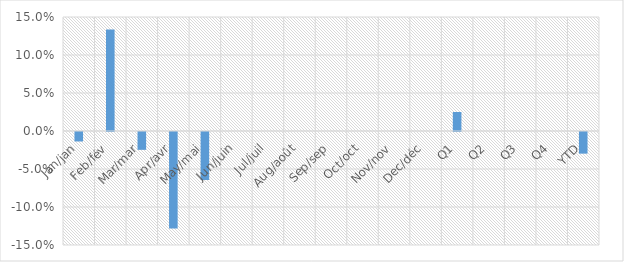
| Category | Total YoY % Change |
|---|---|
| Jan/jan | -0.012 |
| Feb/fév | 0.133 |
| Mar/mar | -0.023 |
| Apr/avr | -0.127 |
| May/mai | -0.063 |
| Jun/juin | 0 |
| Jul/juil | 0 |
| Aug/août | 0 |
| Sep/sep | 0 |
| Oct/oct | 0 |
| Nov/nov | 0 |
| Dec/déc | 0 |
| Q1 | 0.025 |
| Q2 | 0 |
| Q3 | 0 |
| Q4 | 0 |
| YTD | -0.028 |